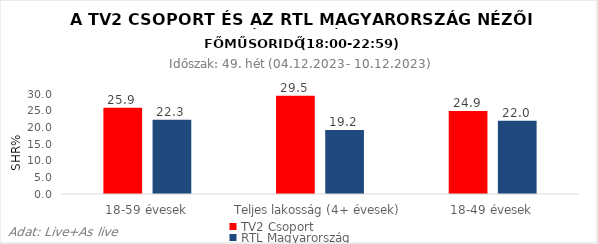
| Category | TV2 Csoport | RTL Magyarország |
|---|---|---|
| 18-59 évesek | 25.9 | 22.3 |
| Teljes lakosság (4+ évesek) | 29.5 | 19.2 |
| 18-49 évesek | 24.9 | 22 |